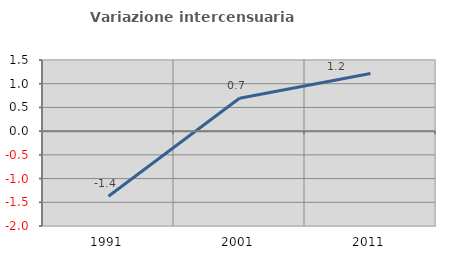
| Category | Variazione intercensuaria annua |
|---|---|
| 1991.0 | -1.374 |
| 2001.0 | 0.692 |
| 2011.0 | 1.214 |